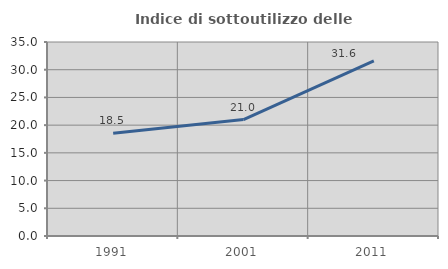
| Category | Indice di sottoutilizzo delle abitazioni  |
|---|---|
| 1991.0 | 18.547 |
| 2001.0 | 21.015 |
| 2011.0 | 31.598 |